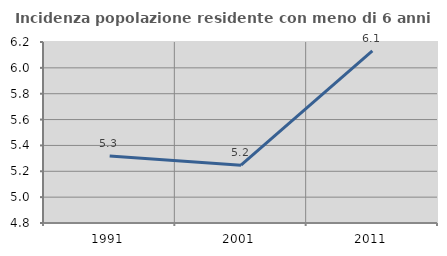
| Category | Incidenza popolazione residente con meno di 6 anni |
|---|---|
| 1991.0 | 5.318 |
| 2001.0 | 5.247 |
| 2011.0 | 6.131 |